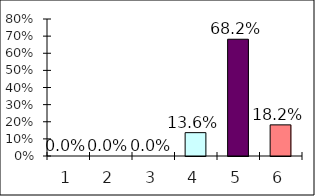
| Category | Series 0 |
|---|---|
| 0 | 0 |
| 1 | 0 |
| 2 | 0 |
| 3 | 0.136 |
| 4 | 0.682 |
| 5 | 0.182 |